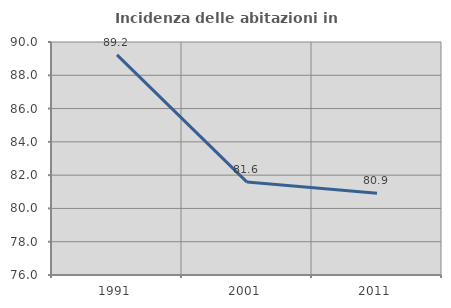
| Category | Incidenza delle abitazioni in proprietà  |
|---|---|
| 1991.0 | 89.225 |
| 2001.0 | 81.584 |
| 2011.0 | 80.911 |